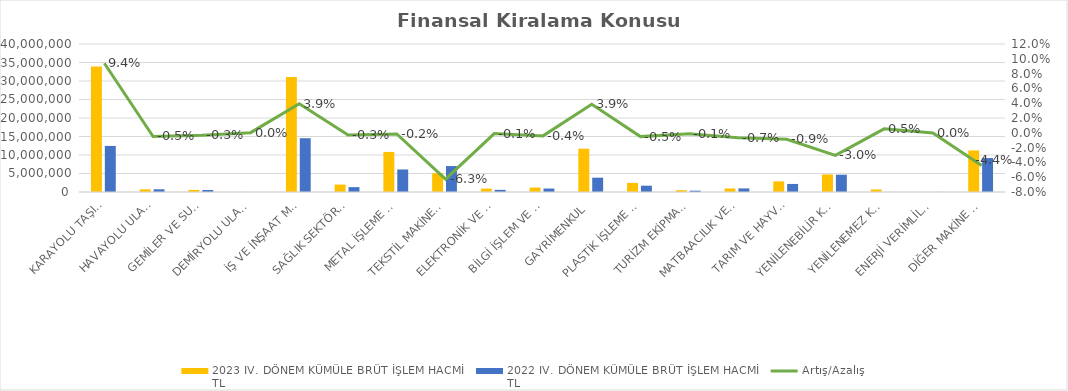
| Category | 2023 IV. DÖNEM KÜMÜLE BRÜT İŞLEM HACMİ 
TL | 2022 IV. DÖNEM KÜMÜLE BRÜT İŞLEM HACMİ 
TL |
|---|---|---|
| KARAYOLU TAŞITLARI | 33948751.854 | 12451848.55 |
| HAVAYOLU ULAŞIM ARAÇLARI | 721899.879 | 732638 |
| GEMİLER VE SUDA YÜZEN TAŞIT VE ARAÇLAR | 572964.919 | 543889.318 |
| DEMİRYOLU ULAŞIM ARAÇLARI | 33801.25 | 6281 |
| İŞ VE İNŞAAT MAKİNELERİ | 31078091.458 | 14533810.366 |
| SAĞLIK SEKTÖRÜ VE ESTETİK EKİPMANLARI | 2011237.773 | 1319613.476 |
| METAL İŞLEME MAKİNELERİ | 10828026.775 | 6089279.436 |
| TEKSTİL MAKİNELERİ | 5083389.075 | 7010397.747 |
| ELEKTRONİK VE OPTİK CİHAZLAR | 919695.318 | 580877.305 |
| BİLGİ İŞLEM VE BÜRO SİSTEMLERİ | 1188011.401 | 935715.717 |
| GAYRİMENKUL | 11706884.561 | 3871159.281 |
| PLASTİK İŞLEME MAKİNELERİ | 2465160.834 | 1707234.762 |
| TURİZM EKİPMANLARI | 486108.867 | 358406.217 |
| MATBAACILIK VE KAĞIT İŞLEME MAKİNELERİ | 948268.389 | 968743.128 |
| TARIM VE HAYVANCILIK MAKİNELERİ | 2876905.56 | 2179738.339 |
| YENİLENEBİLİR KAYNAKLI ELEKTRİK ENERJİSİ ÜRETİM EKİPMANLARI | 4749946.362 | 4672660.392 |
| YENİLENEMEZ KAYNAKLI ELEKTRİK ENERJİSİ ÜRETİM EKİPMANLARI | 683764 | 16340.788 |
| ENERJİ VERİMLİLİĞİ EKİPMANLARI | 0 | 20581.342 |
| DİĞER MAKİNE VE EKİPMANLAR | 11233823.995 | 9165681.821 |